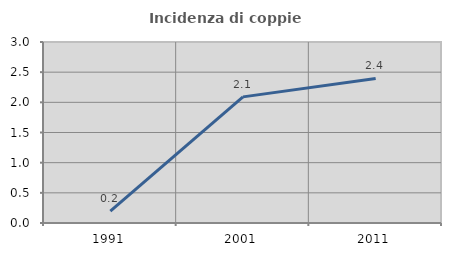
| Category | Incidenza di coppie miste |
|---|---|
| 1991.0 | 0.196 |
| 2001.0 | 2.09 |
| 2011.0 | 2.397 |